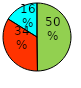
| Category | Series 0 |
|---|---|
| Elternteil A | 0.498 |
| Elternteil B | 0.341 |
| Staat | 0.161 |